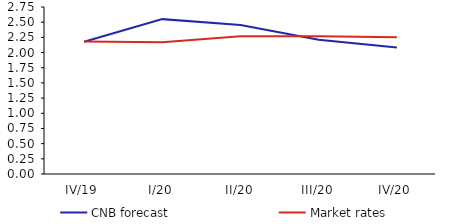
| Category | CNB forecast | Market rates |
|---|---|---|
| IV/19 | 2.178 | 2.18 |
| I/20 | 2.55 | 2.17 |
| II/20 | 2.455 | 2.27 |
| III/20 | 2.211 | 2.27 |
| IV/20 | 2.082 | 2.25 |